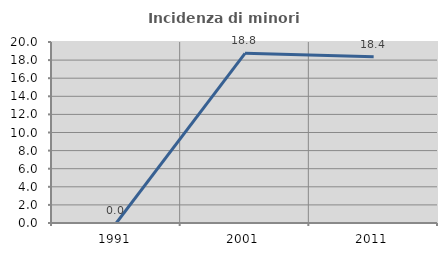
| Category | Incidenza di minori stranieri |
|---|---|
| 1991.0 | 0 |
| 2001.0 | 18.75 |
| 2011.0 | 18.367 |